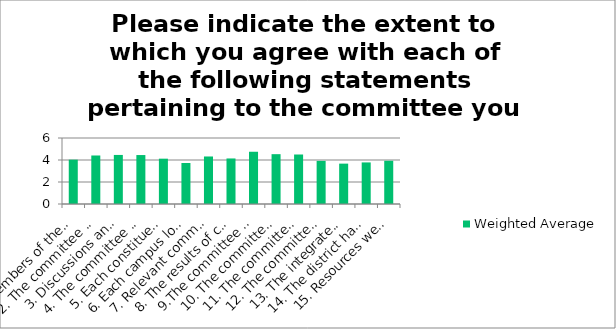
| Category | Weighted Average |
|---|---|
| 1. Members of the committee attend regularly. | 4.03 |
| 2. The committee members had appropriate information to make informed decisions. | 4.41 |
| 3. Discussions and decisions were data-driven and supported by sound evidence. | 4.46 |
| 4. The committee accomplished what it set out to do. | 4.45 |
| 5. Each constituent group had representation on this committee. | 4.12 |
| 6. Each campus location had representation on this committee. | 3.73 |
| 7. Relevant committee information was effectively communicated to appropriate constituents. | 4.32 |
| 8. The results of committee activities are communicated broadly to keep the district informed of changes/improvements. | 4.14 |
| 9.The committee had collegial and collaborative dialogue regarding decisions, plans, etc. | 4.75 |
| 10. The committee followed an effective process for decision making. | 4.53 |
| 11. The committee followed transparent processes. | 4.5 |
| 12. The committee website is generally up to date (minutes, members, charge, etc.). | 3.92 |
| 13. The integrated planning and budgeting process is clear. | 3.67 |
| 14. The district has effectively communicated the outcomes of the planning and governance process. | 3.78 |
| 15. Resources were adequate for committee members at all locations to participate. | 3.93 |